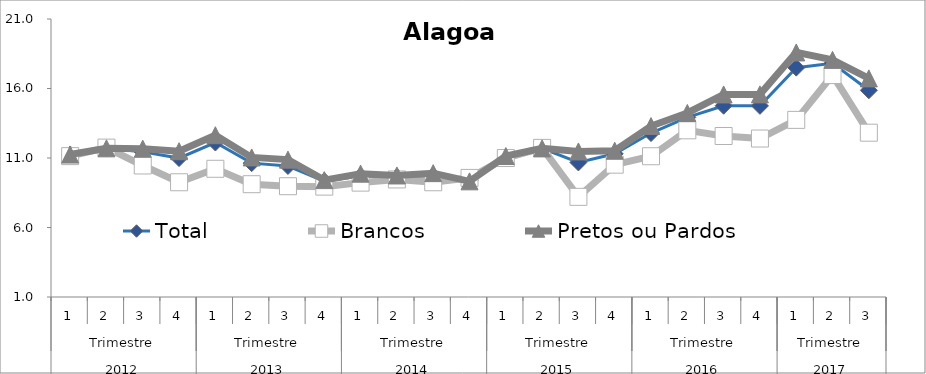
| Category | Total | Brancos | Pretos ou Pardos |
|---|---|---|---|
| 0 | 11.255 | 11.135 | 11.249 |
| 1 | 11.697 | 11.747 | 11.694 |
| 2 | 11.441 | 10.462 | 11.671 |
| 3 | 10.994 | 9.255 | 11.487 |
| 4 | 12.113 | 10.224 | 12.638 |
| 5 | 10.629 | 9.115 | 11.041 |
| 6 | 10.425 | 8.97 | 10.883 |
| 7 | 9.332 | 8.94 | 9.409 |
| 8 | 9.713 | 9.228 | 9.872 |
| 9 | 9.655 | 9.458 | 9.744 |
| 10 | 9.724 | 9.254 | 9.91 |
| 11 | 9.381 | 9.568 | 9.321 |
| 12 | 11.069 | 10.999 | 11.141 |
| 13 | 11.696 | 11.728 | 11.692 |
| 14 | 10.681 | 8.205 | 11.471 |
| 15 | 11.301 | 10.521 | 11.521 |
| 16 | 12.796 | 11.126 | 13.298 |
| 17 | 13.922 | 12.991 | 14.239 |
| 18 | 14.76 | 12.582 | 15.572 |
| 19 | 14.752 | 12.4 | 15.577 |
| 20 | 17.501 | 13.742 | 18.595 |
| 21 | 17.815 | 16.966 | 18.058 |
| 22 | 15.871 | 12.82 | 16.728 |